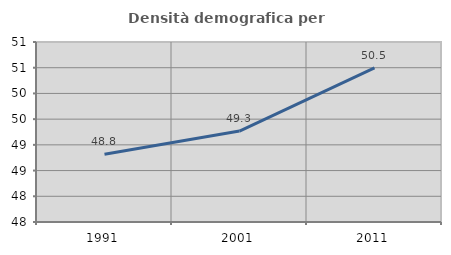
| Category | Densità demografica |
|---|---|
| 1991.0 | 48.819 |
| 2001.0 | 49.269 |
| 2011.0 | 50.496 |